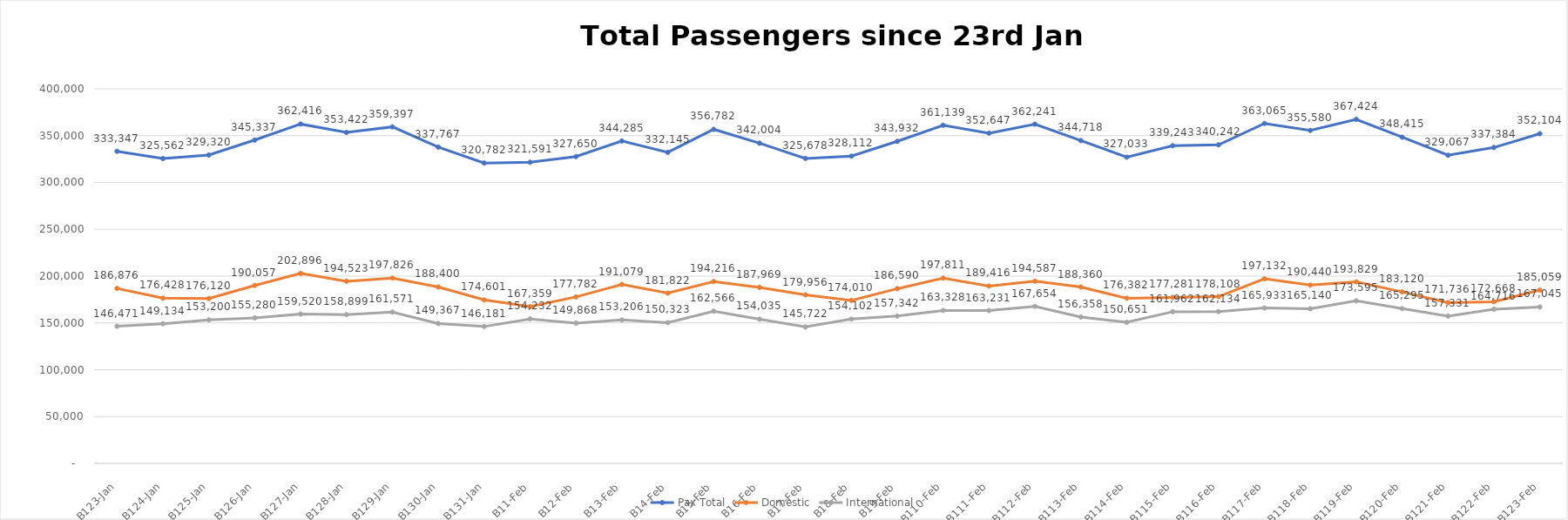
| Category | Pax Total |  Domestic  |  International  |
|---|---|---|---|
| 2023-01-23 | 333347 | 186876 | 146471 |
| 2023-01-24 | 325562 | 176428 | 149134 |
| 2023-01-25 | 329320 | 176120 | 153200 |
| 2023-01-26 | 345337 | 190057 | 155280 |
| 2023-01-27 | 362416 | 202896 | 159520 |
| 2023-01-28 | 353422 | 194523 | 158899 |
| 2023-01-29 | 359397 | 197826 | 161571 |
| 2023-01-30 | 337767 | 188400 | 149367 |
| 2023-01-31 | 320782 | 174601 | 146181 |
| 2023-02-01 | 321591 | 167359 | 154232 |
| 2023-02-02 | 327650 | 177782 | 149868 |
| 2023-02-03 | 344285 | 191079 | 153206 |
| 2023-02-04 | 332145 | 181822 | 150323 |
| 2023-02-05 | 356782 | 194216 | 162566 |
| 2023-02-06 | 342004 | 187969 | 154035 |
| 2023-02-07 | 325678 | 179956 | 145722 |
| 2023-02-08 | 328112 | 174010 | 154102 |
| 2023-02-09 | 343932 | 186590 | 157342 |
| 2023-02-10 | 361139 | 197811 | 163328 |
| 2023-02-11 | 352647 | 189416 | 163231 |
| 2023-02-12 | 362241 | 194587 | 167654 |
| 2023-02-13 | 344718 | 188360 | 156358 |
| 2023-02-14 | 327033 | 176382 | 150651 |
| 2023-02-15 | 339243 | 177281 | 161962 |
| 2023-02-16 | 340242 | 178108 | 162134 |
| 2023-02-17 | 363065 | 197132 | 165933 |
| 2023-02-18 | 355580 | 190440 | 165140 |
| 2023-02-19 | 367424 | 193829 | 173595 |
| 2023-02-20 | 348415 | 183120 | 165295 |
| 2023-02-21 | 329067 | 171736 | 157331 |
| 2023-02-22 | 337384 | 172668 | 164716 |
| 2023-02-23 | 352104 | 185059 | 167045 |